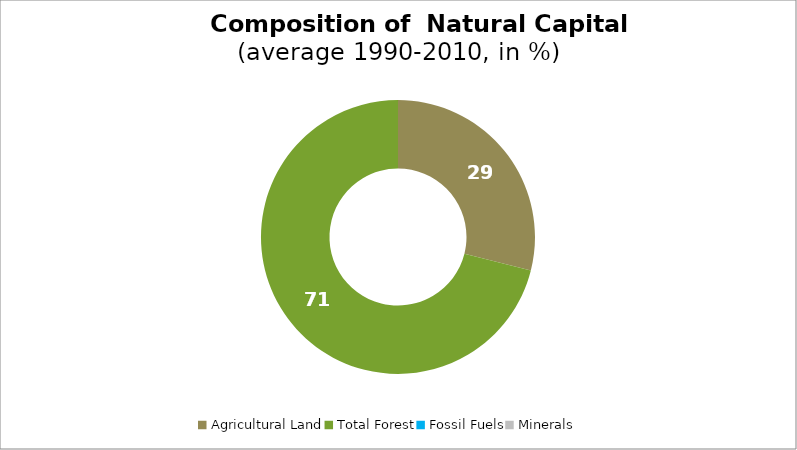
| Category | Series 0 |
|---|---|
| Agricultural Land | 28.93 |
| Total Forest | 71.07 |
| Fossil Fuels | 0 |
| Minerals | 0 |